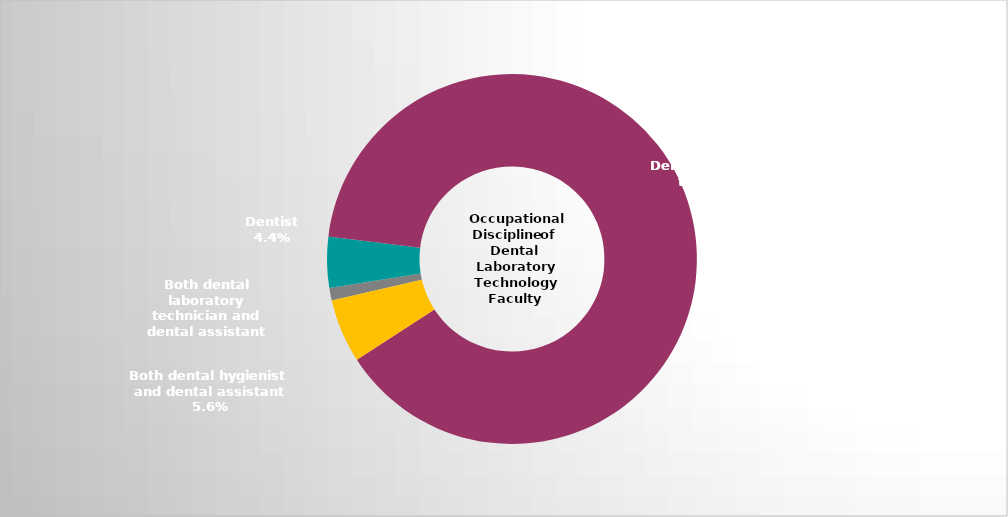
| Category | Series 2 |
|---|---|
| Both dental laboratory technician and dental assistant | 0.011 |
| Dentist | 0.044 |
| Dental laboratory technician | 0.889 |
| Both dental hygienist and dental assistant | 0.056 |